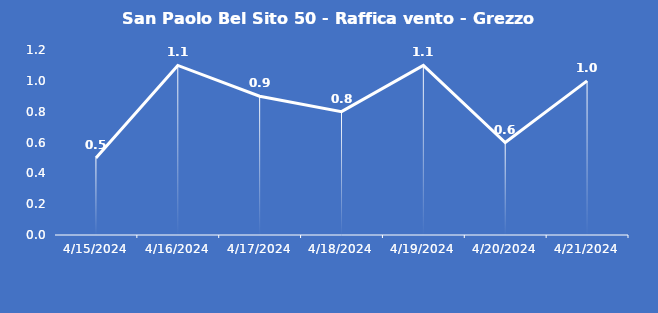
| Category | San Paolo Bel Sito 50 - Raffica vento - Grezzo (m/s) |
|---|---|
| 4/15/24 | 0.5 |
| 4/16/24 | 1.1 |
| 4/17/24 | 0.9 |
| 4/18/24 | 0.8 |
| 4/19/24 | 1.1 |
| 4/20/24 | 0.6 |
| 4/21/24 | 1 |